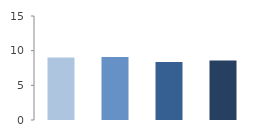
| Category | Rate (%) |
|---|---|
| 2009.0 | 9.03 |
| 2010.0 | 9.09 |
| 2011.0 | 8.362 |
| 2012.0 | 8.592 |